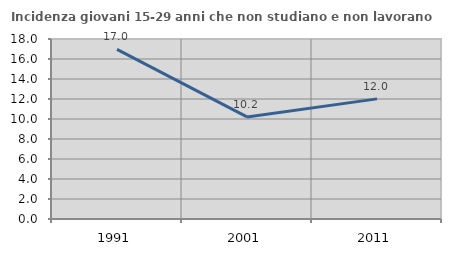
| Category | Incidenza giovani 15-29 anni che non studiano e non lavorano  |
|---|---|
| 1991.0 | 16.959 |
| 2001.0 | 10.206 |
| 2011.0 | 12.013 |